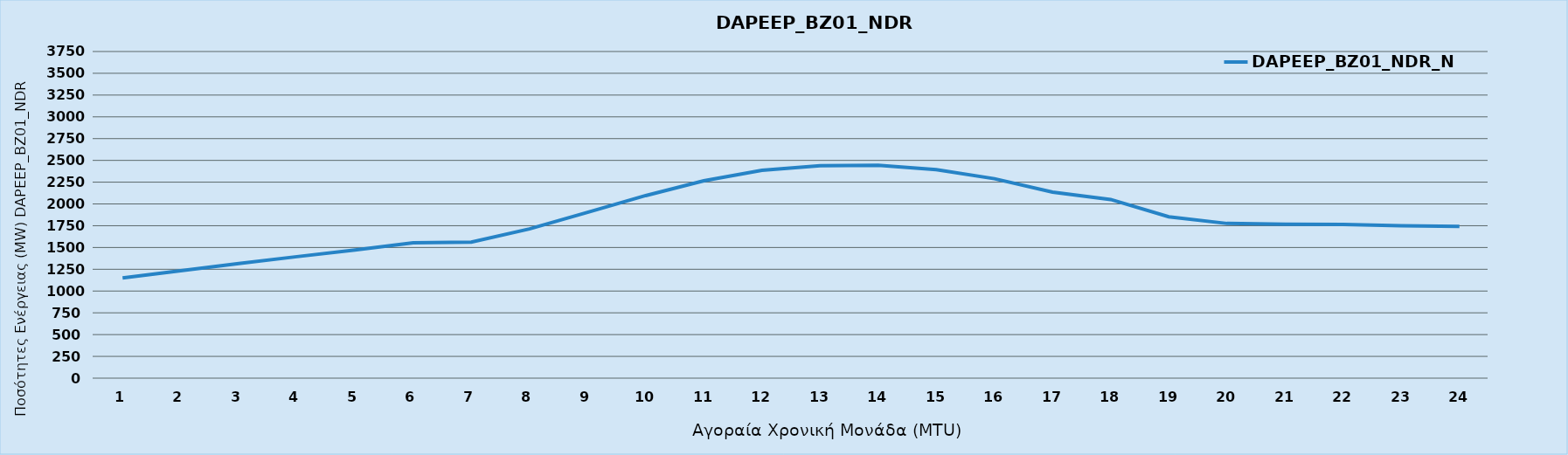
| Category | DAPEEP_BZ01_NDR_N1 |
|---|---|
| 0 | 1150 |
| 1 | 1234 |
| 2 | 1317 |
| 3 | 1395 |
| 4 | 1472 |
| 5 | 1553 |
| 6 | 1562 |
| 7 | 1713 |
| 8 | 1903 |
| 9 | 2096 |
| 10 | 2266 |
| 11 | 2386 |
| 12 | 2438 |
| 13 | 2443 |
| 14 | 2394 |
| 15 | 2290 |
| 16 | 2135 |
| 17 | 2051 |
| 18 | 1853 |
| 19 | 1776 |
| 20 | 1766 |
| 21 | 1764 |
| 22 | 1749 |
| 23 | 1743 |